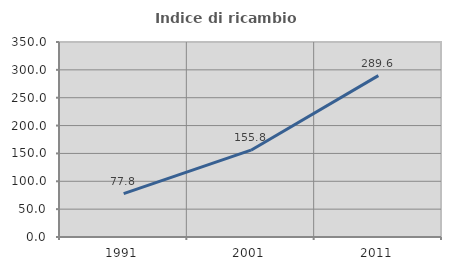
| Category | Indice di ricambio occupazionale  |
|---|---|
| 1991.0 | 77.759 |
| 2001.0 | 155.825 |
| 2011.0 | 289.623 |